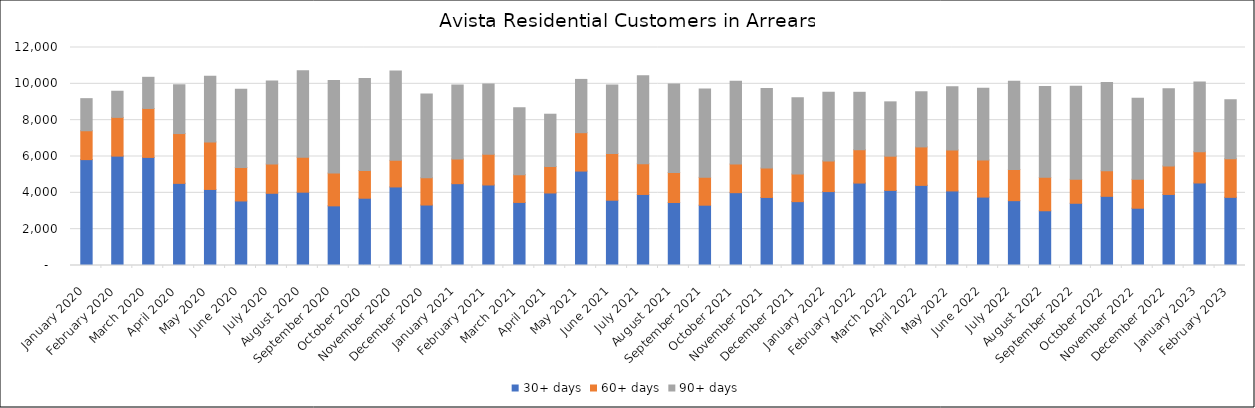
| Category | 30+ days | 60+ days | 90+ days |
|---|---|---|---|
| 2020-01-01 | 5828 | 1590 | 1766 |
| 2020-02-01 | 6021 | 2133 | 1438 |
| 2020-03-01 | 5950 | 2695 | 1714 |
| 2020-04-01 | 4521 | 2742 | 2685 |
| 2020-05-01 | 4187 | 2616 | 3618 |
| 2020-06-01 | 3552 | 1846 | 4309 |
| 2020-07-01 | 3975 | 1614 | 4566 |
| 2020-08-01 | 4036 | 1922 | 4761 |
| 2020-09-01 | 3283 | 1803 | 5092 |
| 2020-10-01 | 3704 | 1525 | 5067 |
| 2020-11-01 | 4324 | 1465 | 4912 |
| 2020-12-01 | 3329 | 1497 | 4614 |
| 2021-01-01 | 4504 | 1354 | 4072 |
| 2021-02-01 | 4432 | 1692 | 3860 |
| 2021-03-01 | 3472 | 1529 | 3683 |
| 2021-04-01 | 3992 | 1456 | 2879 |
| 2021-05-01 | 5198 | 2113 | 2932 |
| 2021-06-01 | 3593 | 2566 | 3770 |
| 2021-07-01 | 3911 | 1692 | 4838 |
| 2021-08-01 | 3467 | 1657 | 4872 |
| 2021-09-01 | 3320 | 1532 | 4857 |
| 2021-10-01 | 4009 | 1575 | 4559 |
| 2021-11-01 | 3746 | 1618 | 4373 |
| 2021-12-01 | 3515 | 1519 | 4195 |
| 2022-01-01 | 4069 | 1690 | 3782 |
| 2022-02-01 | 4538 | 1835 | 3161 |
| 2022-03-01 | 4134 | 1884 | 2990 |
| 2022-04-01 | 4411 | 2116 | 3036 |
| 2022-05-01 | 4104 | 2260 | 3474 |
| 2022-06-01 | 3766 | 2045 | 3943 |
| 2022-07-01 | 3569 | 1710 | 4860 |
| 2022-08-01 | 3013 | 1838 | 5001 |
| 2022-09-01 | 3425 | 1317 | 5126 |
| 2022-10-01 | 3808 | 1403 | 4866 |
| 2022-11-01 | 3153 | 1591 | 4456 |
| 2022-12-01 | 3911 | 1569 | 4256 |
| 2023-01-01 | 4543 | 1716 | 3848 |
| 2023-02-01 | 3752 | 2124 | 3248 |